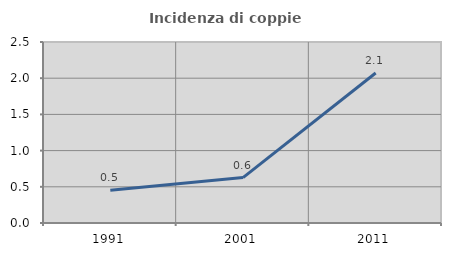
| Category | Incidenza di coppie miste |
|---|---|
| 1991.0 | 0.451 |
| 2001.0 | 0.628 |
| 2011.0 | 2.072 |